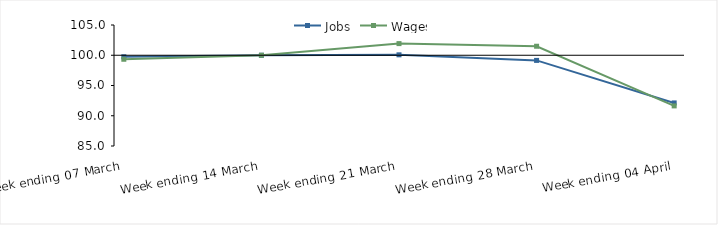
| Category | Jobs | Wages |
|---|---|---|
| 0 | 99.749 | 99.337 |
| 1900-01-01 | 100 | 100 |
| 1900-01-02 | 100.071 | 101.924 |
| 1900-01-03 | 99.148 | 101.489 |
| 1900-01-04 | 92.12 | 91.628 |